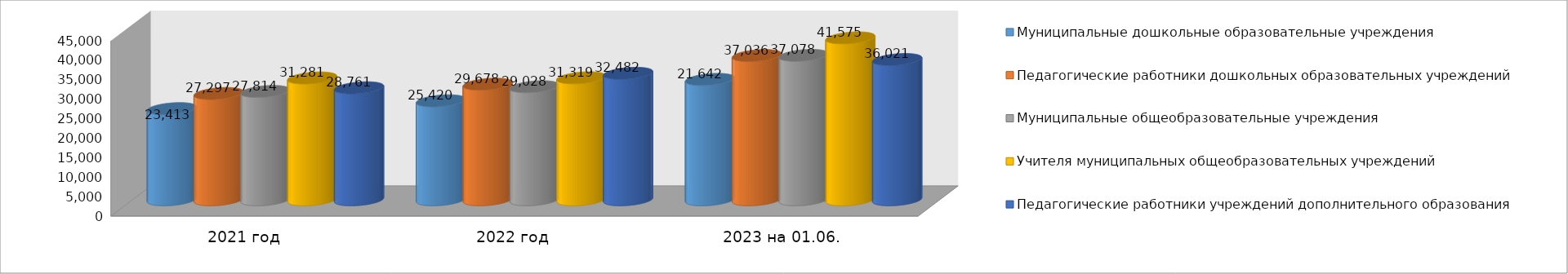
| Category | Муниципальные дошкольные образовательные учреждения | Педагогические работники дошкольных образовательных учреждений | Муниципальные общеобразовательные учреждения | Учителя муниципальных общеобразовательных учреждений | Педагогические работники учреждений дополнительного образования |
|---|---|---|---|---|---|
| 2021 год | 23413 | 27297 | 27814 | 31281 | 28761 |
| 2022 год | 25420 | 29678 | 29028 | 31319 | 32482 |
| 2023 на 01.06. | 30909 | 37036 | 37078 | 41575 | 36021 |